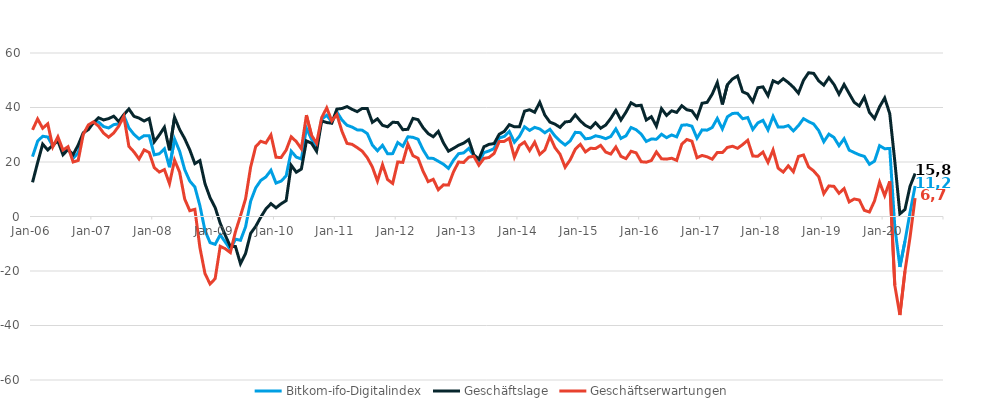
| Category | Bitkom-ifo-Digitalindex  | Geschäftslage | Geschäftserwartungen |
|---|---|---|---|
| 2006-01-01 | 21.963 | 12.541 | 31.802 |
| 2006-02-01 | 27.635 | 19.753 | 35.801 |
| 2006-03-01 | 29.453 | 26.558 | 32.385 |
| 2006-04-01 | 29.17 | 24.423 | 34.017 |
| 2006-05-01 | 25.858 | 26.165 | 25.551 |
| 2006-06-01 | 28.505 | 27.781 | 29.231 |
| 2006-07-01 | 23.525 | 22.666 | 24.387 |
| 2006-08-01 | 25.101 | 24.583 | 25.62 |
| 2006-09-01 | 21.348 | 22.705 | 19.998 |
| 2006-10-01 | 23.375 | 26.223 | 20.562 |
| 2006-11-01 | 30.44 | 30.724 | 30.156 |
| 2006-12-01 | 32.734 | 31.875 | 33.596 |
| 2007-01-01 | 34.55 | 34.382 | 34.718 |
| 2007-02-01 | 34.71 | 36.245 | 33.185 |
| 2007-03-01 | 33.015 | 35.437 | 30.618 |
| 2007-04-01 | 32.481 | 35.919 | 29.093 |
| 2007-05-01 | 33.698 | 36.8 | 30.638 |
| 2007-06-01 | 34.02 | 34.874 | 33.17 |
| 2007-07-01 | 37.066 | 37.374 | 36.758 |
| 2007-08-01 | 32.484 | 39.455 | 25.717 |
| 2007-09-01 | 30.134 | 36.763 | 23.69 |
| 2007-10-01 | 28.477 | 36.106 | 21.095 |
| 2007-11-01 | 29.677 | 35.044 | 24.433 |
| 2007-12-01 | 29.658 | 35.99 | 23.497 |
| 2008-01-01 | 22.619 | 27.405 | 17.933 |
| 2008-02-01 | 23.02 | 29.941 | 16.307 |
| 2008-03-01 | 24.851 | 32.748 | 17.222 |
| 2008-04-01 | 18.083 | 24.284 | 12.053 |
| 2008-05-01 | 28.411 | 36.392 | 20.7 |
| 2008-06-01 | 23.951 | 31.915 | 16.26 |
| 2008-07-01 | 17.195 | 28.56 | 6.396 |
| 2008-08-01 | 13.005 | 24.468 | 2.127 |
| 2008-09-01 | 10.855 | 19.411 | 2.632 |
| 2008-10-01 | 3.923 | 20.522 | -11.427 |
| 2008-11-01 | -5.161 | 12.038 | -20.965 |
| 2008-12-01 | -9.58 | 6.905 | -24.752 |
| 2009-01-01 | -10.215 | 3.295 | -22.827 |
| 2009-02-01 | -6.745 | -2.465 | -10.932 |
| 2009-03-01 | -9.379 | -6.894 | -11.833 |
| 2009-04-01 | -12.115 | -10.992 | -13.232 |
| 2009-05-01 | -8.314 | -10.974 | -5.616 |
| 2009-06-01 | -8.739 | -17.328 | 0.253 |
| 2009-07-01 | -3.79 | -13.546 | 6.476 |
| 2009-08-01 | 5.621 | -6.182 | 18.143 |
| 2009-09-01 | 10.515 | -3.622 | 25.67 |
| 2009-10-01 | 13.235 | -0.23 | 27.606 |
| 2009-11-01 | 14.523 | 2.753 | 26.977 |
| 2009-12-01 | 16.962 | 4.718 | 29.937 |
| 2010-01-01 | 12.267 | 3.201 | 21.737 |
| 2010-02-01 | 12.982 | 4.656 | 21.646 |
| 2010-03-01 | 14.889 | 5.822 | 24.356 |
| 2010-04-01 | 23.956 | 18.788 | 29.246 |
| 2010-05-01 | 21.801 | 16.248 | 27.495 |
| 2010-06-01 | 21.097 | 17.409 | 24.847 |
| 2010-07-01 | 32.425 | 27.751 | 37.195 |
| 2010-08-01 | 28.349 | 26.891 | 29.816 |
| 2010-09-01 | 25.407 | 23.936 | 26.887 |
| 2010-10-01 | 35.671 | 35.075 | 36.268 |
| 2010-11-01 | 37.157 | 34.481 | 39.863 |
| 2010-12-01 | 34.67 | 34.237 | 35.105 |
| 2011-01-01 | 38.4 | 39.413 | 37.39 |
| 2011-02-01 | 35.414 | 39.629 | 31.274 |
| 2011-03-01 | 33.479 | 40.334 | 26.819 |
| 2011-04-01 | 32.816 | 39.33 | 26.48 |
| 2011-05-01 | 31.792 | 38.476 | 25.295 |
| 2011-06-01 | 31.679 | 39.669 | 23.956 |
| 2011-07-01 | 30.423 | 39.623 | 21.576 |
| 2011-08-01 | 26.213 | 34.559 | 18.164 |
| 2011-09-01 | 24.13 | 35.836 | 13.005 |
| 2011-10-01 | 26.128 | 33.46 | 19.026 |
| 2011-11-01 | 23.02 | 32.914 | 13.547 |
| 2011-12-01 | 23.075 | 34.573 | 12.14 |
| 2012-01-01 | 27.145 | 34.497 | 20.023 |
| 2012-02-01 | 25.774 | 31.846 | 19.86 |
| 2012-03-01 | 29.258 | 32.015 | 26.534 |
| 2012-04-01 | 29.051 | 35.998 | 22.308 |
| 2012-05-01 | 28.365 | 35.535 | 21.414 |
| 2012-06-01 | 24.443 | 32.588 | 16.583 |
| 2012-07-01 | 21.436 | 30.428 | 12.795 |
| 2012-08-01 | 21.312 | 29.26 | 13.639 |
| 2012-09-01 | 20.267 | 31.235 | 9.82 |
| 2012-10-01 | 19.205 | 27.062 | 11.62 |
| 2012-11-01 | 17.662 | 23.977 | 11.525 |
| 2012-12-01 | 20.682 | 25.028 | 16.42 |
| 2013-01-01 | 23.056 | 26.151 | 20.003 |
| 2013-02-01 | 23.352 | 26.938 | 19.823 |
| 2013-03-01 | 24.979 | 28.234 | 21.77 |
| 2013-04-01 | 22.358 | 22.618 | 22.099 |
| 2013-05-01 | 19.947 | 21.073 | 18.827 |
| 2013-06-01 | 23.449 | 25.6 | 21.319 |
| 2013-07-01 | 24.057 | 26.476 | 21.664 |
| 2013-08-01 | 24.946 | 26.764 | 23.143 |
| 2013-09-01 | 28.821 | 30.172 | 27.477 |
| 2013-10-01 | 29.389 | 31.227 | 27.566 |
| 2013-11-01 | 31.204 | 33.7 | 28.734 |
| 2013-12-01 | 27.258 | 32.924 | 21.73 |
| 2014-01-01 | 29.455 | 32.899 | 26.062 |
| 2014-02-01 | 32.921 | 38.654 | 27.326 |
| 2014-03-01 | 31.582 | 39.191 | 24.215 |
| 2014-04-01 | 32.704 | 38.26 | 27.278 |
| 2014-05-01 | 32.139 | 41.89 | 22.78 |
| 2014-06-01 | 30.723 | 37.213 | 24.411 |
| 2014-07-01 | 31.994 | 34.645 | 29.373 |
| 2014-08-01 | 29.546 | 33.899 | 25.274 |
| 2014-09-01 | 27.706 | 32.701 | 22.817 |
| 2014-10-01 | 26.228 | 34.685 | 18.075 |
| 2014-11-01 | 27.754 | 34.915 | 20.811 |
| 2014-12-01 | 30.887 | 37.292 | 24.656 |
| 2015-01-01 | 30.753 | 35.092 | 26.495 |
| 2015-02-01 | 28.502 | 33.407 | 23.7 |
| 2015-03-01 | 28.726 | 32.481 | 25.032 |
| 2015-04-01 | 29.621 | 34.398 | 24.942 |
| 2015-05-01 | 29.225 | 32.395 | 26.098 |
| 2015-06-01 | 28.552 | 33.562 | 23.649 |
| 2015-07-01 | 29.356 | 35.986 | 22.911 |
| 2015-08-01 | 32.134 | 38.948 | 25.515 |
| 2015-09-01 | 28.646 | 35.413 | 22.073 |
| 2015-10-01 | 29.614 | 38.312 | 21.234 |
| 2015-11-01 | 32.662 | 41.726 | 23.939 |
| 2015-12-01 | 31.835 | 40.632 | 23.359 |
| 2016-01-01 | 30.236 | 40.838 | 20.1 |
| 2016-02-01 | 27.533 | 35.398 | 19.93 |
| 2016-03-01 | 28.439 | 36.619 | 20.542 |
| 2016-04-01 | 28.363 | 33.131 | 23.693 |
| 2016-05-01 | 30.192 | 39.575 | 21.176 |
| 2016-06-01 | 28.933 | 37.09 | 21.056 |
| 2016-07-01 | 29.923 | 38.788 | 21.387 |
| 2016-08-01 | 29.224 | 38.196 | 20.59 |
| 2016-09-01 | 33.487 | 40.649 | 26.539 |
| 2016-10-01 | 33.656 | 39.177 | 28.262 |
| 2016-11-01 | 33.145 | 38.772 | 27.651 |
| 2016-12-01 | 28.741 | 36.144 | 21.57 |
| 2017-01-01 | 31.784 | 41.557 | 22.407 |
| 2017-02-01 | 31.676 | 41.885 | 21.898 |
| 2017-03-01 | 32.662 | 44.904 | 21.031 |
| 2017-04-01 | 35.981 | 49.151 | 23.507 |
| 2017-05-01 | 32.129 | 41.122 | 23.472 |
| 2017-06-01 | 36.59 | 48.397 | 25.344 |
| 2017-07-01 | 37.812 | 50.478 | 25.787 |
| 2017-08-01 | 37.927 | 51.564 | 25.028 |
| 2017-09-01 | 35.878 | 45.76 | 26.393 |
| 2017-10-01 | 36.313 | 44.95 | 27.98 |
| 2017-11-01 | 31.947 | 42.146 | 22.177 |
| 2017-12-01 | 34.358 | 47.265 | 22.124 |
| 2018-01-01 | 35.303 | 47.579 | 23.636 |
| 2018-02-01 | 31.785 | 44.352 | 19.865 |
| 2018-03-01 | 36.769 | 49.807 | 24.411 |
| 2018-04-01 | 32.813 | 48.944 | 17.727 |
| 2018-05-01 | 32.798 | 50.548 | 16.306 |
| 2018-06-01 | 33.377 | 49.151 | 18.601 |
| 2018-07-01 | 31.416 | 47.449 | 16.422 |
| 2018-08-01 | 33.356 | 45.251 | 22.038 |
| 2018-09-01 | 35.891 | 50.005 | 22.574 |
| 2018-10-01 | 34.832 | 52.749 | 18.186 |
| 2018-11-01 | 33.934 | 52.525 | 16.711 |
| 2018-12-01 | 31.512 | 49.77 | 14.588 |
| 2019-01-01 | 27.43 | 48.214 | 8.387 |
| 2019-02-01 | 30.234 | 50.959 | 11.222 |
| 2019-03-01 | 29.01 | 48.484 | 11.062 |
| 2019-04-01 | 25.976 | 44.889 | 8.524 |
| 2019-05-01 | 28.549 | 48.444 | 10.248 |
| 2019-06-01 | 24.361 | 45.133 | 5.349 |
| 2019-07-01 | 23.463 | 41.899 | 6.432 |
| 2019-08-01 | 22.626 | 40.549 | 6.038 |
| 2019-09-01 | 22.063 | 43.802 | 2.263 |
| 2019-10-01 | 19.161 | 38.204 | 1.64 |
| 2019-11-01 | 20.32 | 35.95 | 5.724 |
| 2019-12-01 | 25.994 | 40.274 | 12.563 |
| 2020-01-01 | 24.866 | 43.5 | 7.657 |
| 2020-02-01 | 24.978 | 37.765 | 12.878 |
| 2020-03-01 | -3.841 | 20.25 | -25.297 |
| 2020-04-01 | -18.521 | 0.983 | -36.133 |
| 2020-05-01 | -9.107 | 2.566 | -20.107 |
| 2020-06-01 | 1.5 | 11.072 | -7.638 |
| 2020-07-01 | 11.212 | 15.775 | 6.745 |